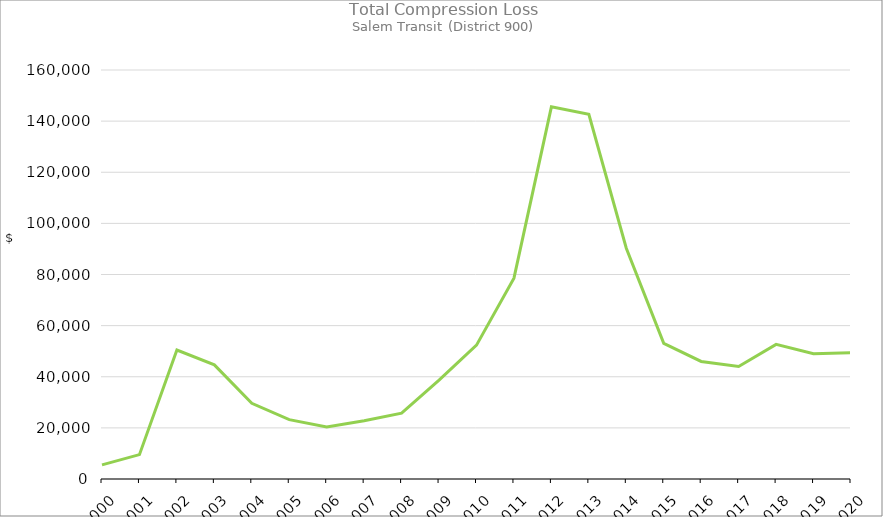
| Category | Series 0 |
|---|---|
| 2000.0 | 5507.53 |
| 2001.0 | 9532.42 |
| 2002.0 | 50442.61 |
| 2003.0 | 44649 |
| 2004.0 | 29618.56 |
| 2005.0 | 23207.92 |
| 2006.0 | 20347.68 |
| 2007.0 | 22759.27 |
| 2008.0 | 25762.18 |
| 2009.0 | 38700.14 |
| 2010.0 | 52350.3 |
| 2011.0 | 78582.01 |
| 2012.0 | 145587.43 |
| 2013.0 | 142696.98 |
| 2014.0 | 90288.18 |
| 2015.0 | 53055.82 |
| 2016.0 | 45992.62 |
| 2017.0 | 44015.8 |
| 2018.0 | 52650.25 |
| 2019.0 | 49001.6 |
| 2020.0 | 49406.42 |